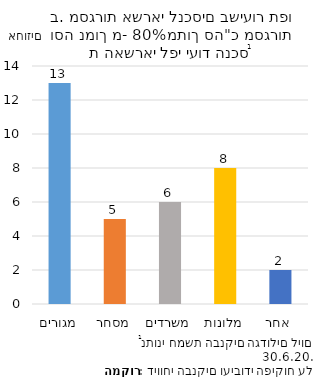
| Category | Series 0 |
|---|---|
| מגורים | 13 |
| מסחר | 5 |
| משרדים | 6 |
| מלונות | 8 |
| אחר | 2 |